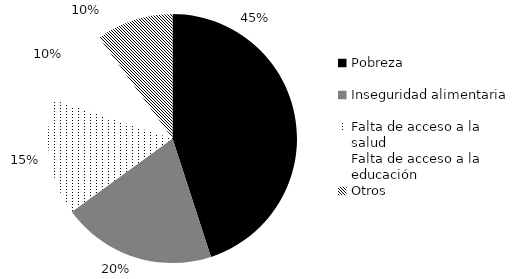
| Category | Series 0 |
|---|---|
| Pobreza | 18 |
| Inseguridad alimentaria  | 8 |
| Falta de acceso a la salud | 6 |
| Falta de acceso a la educación | 4 |
| Otros | 4 |